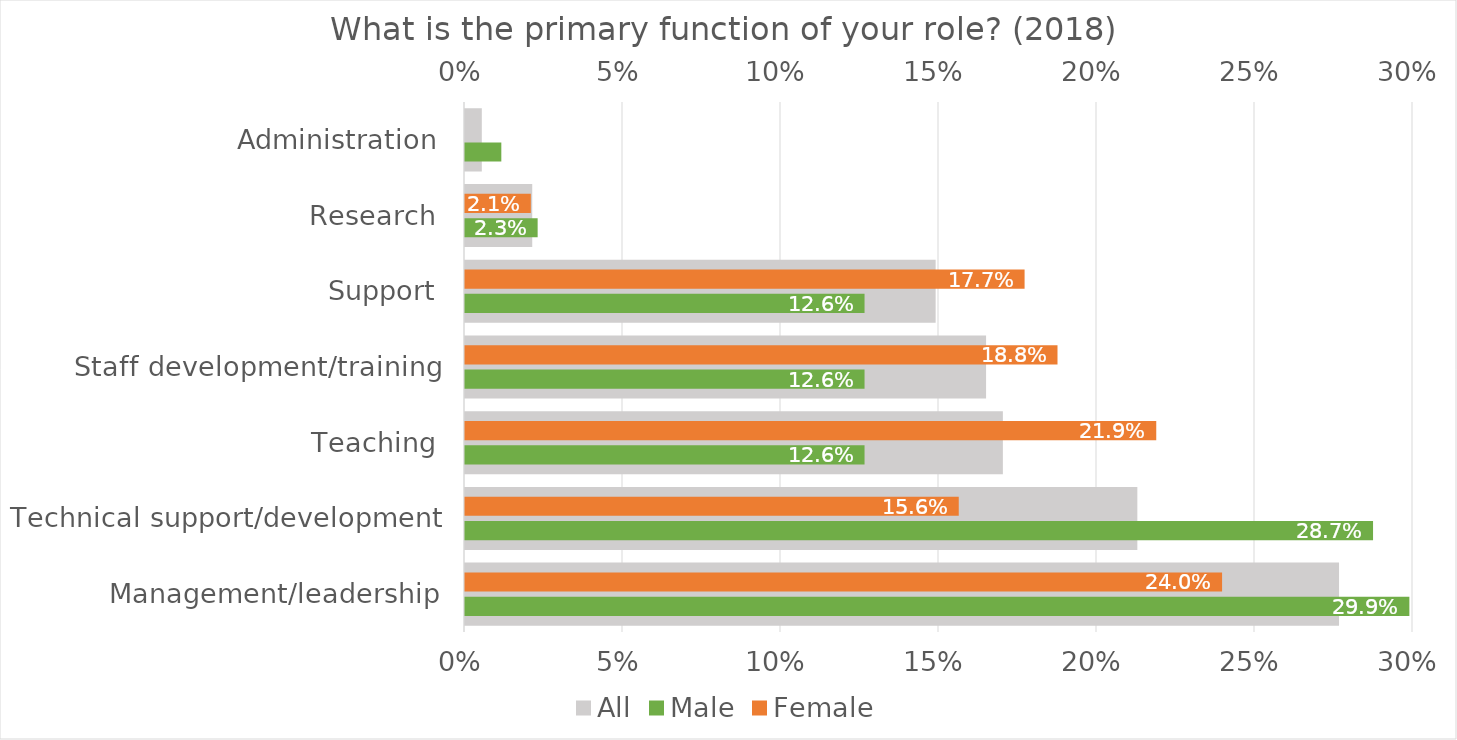
| Category | All |
|---|---|
| Management/leadership | 0.277 |
| Technical support/development | 0.213 |
| Teaching | 0.17 |
| Staff development/training | 0.165 |
| Support | 0.149 |
| Research | 0.021 |
| Administration | 0.005 |